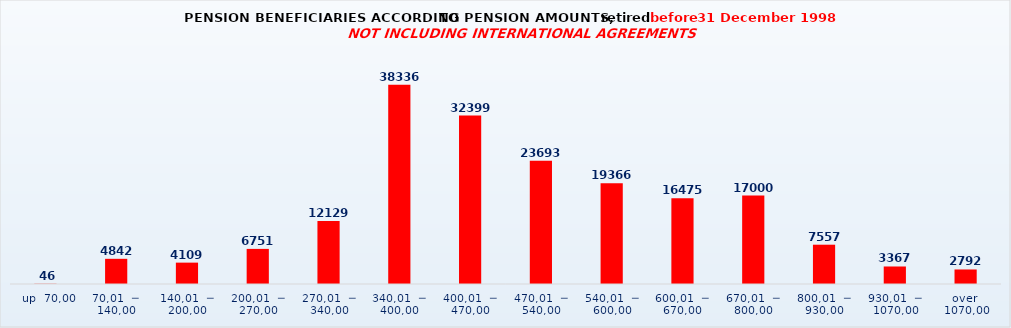
| Category | Series 0 |
|---|---|
|   up  70,00 | 46 |
| 70,01  ─  140,00 | 4842 |
| 140,01  ─  200,00 | 4109 |
| 200,01  ─  270,00 | 6751 |
| 270,01  ─  340,00 | 12129 |
| 340,01  ─  400,00 | 38336 |
| 400,01  ─  470,00 | 32399 |
| 470,01  ─  540,00 | 23693 |
| 540,01  ─  600,00 | 19366 |
| 600,01  ─  670,00 | 16475 |
| 670,01  ─  800,00 | 17000 |
| 800,01  ─  930,00 | 7557 |
| 930,01  ─  1070,00 | 3367 |
| over  1070,00 | 2792 |